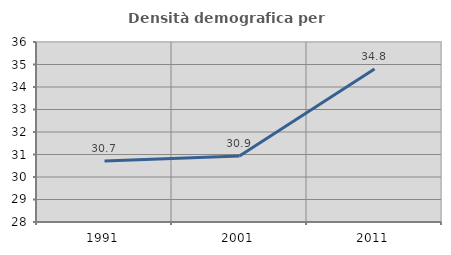
| Category | Densità demografica |
|---|---|
| 1991.0 | 30.707 |
| 2001.0 | 30.932 |
| 2011.0 | 34.796 |